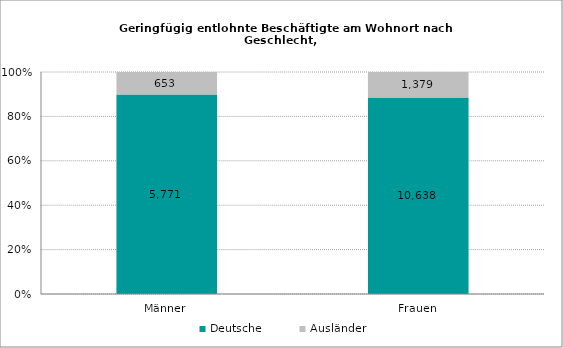
| Category | Deutsche | Ausländer |
|---|---|---|
| Männer | 5771 | 653 |
| Frauen | 10638 | 1379 |